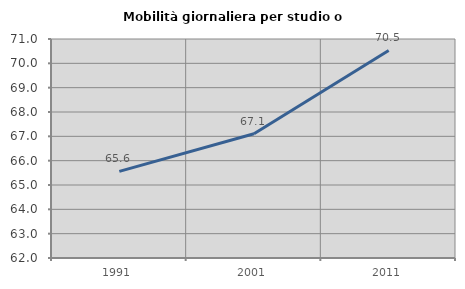
| Category | Mobilità giornaliera per studio o lavoro |
|---|---|
| 1991.0 | 65.561 |
| 2001.0 | 67.108 |
| 2011.0 | 70.531 |